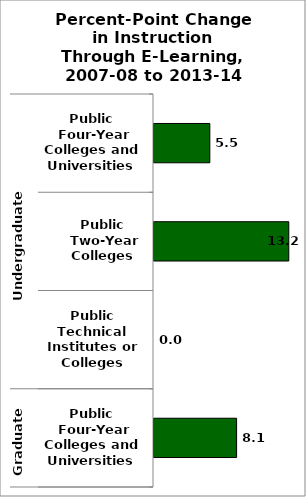
| Category | State |
|---|---|
| 0 | 5.465 |
| 1 | 13.196 |
| 2 | 0 |
| 3 | 8.086 |